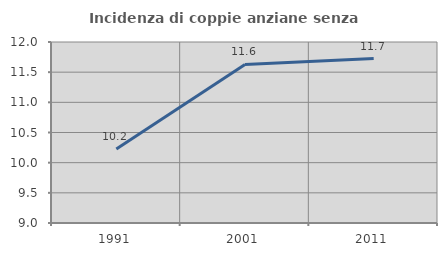
| Category | Incidenza di coppie anziane senza figli  |
|---|---|
| 1991.0 | 10.225 |
| 2001.0 | 11.628 |
| 2011.0 | 11.726 |